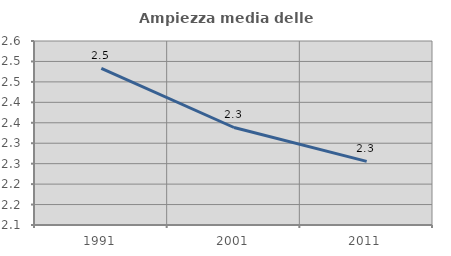
| Category | Ampiezza media delle famiglie |
|---|---|
| 1991.0 | 2.483 |
| 2001.0 | 2.338 |
| 2011.0 | 2.256 |